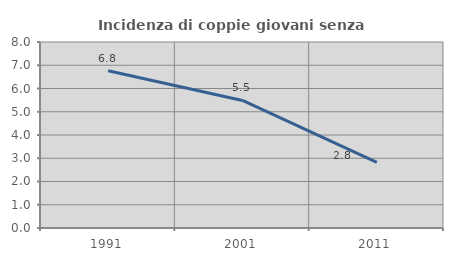
| Category | Incidenza di coppie giovani senza figli |
|---|---|
| 1991.0 | 6.763 |
| 2001.0 | 5.485 |
| 2011.0 | 2.823 |